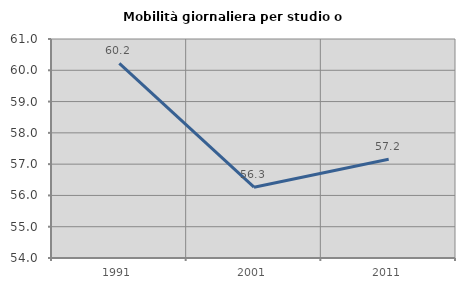
| Category | Mobilità giornaliera per studio o lavoro |
|---|---|
| 1991.0 | 60.22 |
| 2001.0 | 56.263 |
| 2011.0 | 57.155 |